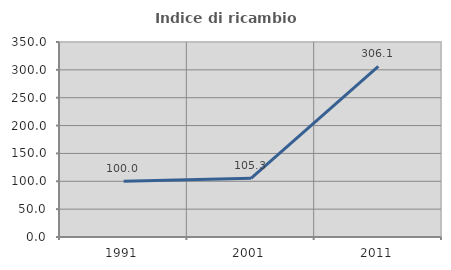
| Category | Indice di ricambio occupazionale  |
|---|---|
| 1991.0 | 100 |
| 2001.0 | 105.263 |
| 2011.0 | 306.061 |